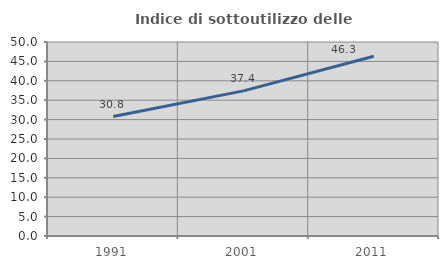
| Category | Indice di sottoutilizzo delle abitazioni  |
|---|---|
| 1991.0 | 30.796 |
| 2001.0 | 37.405 |
| 2011.0 | 46.337 |